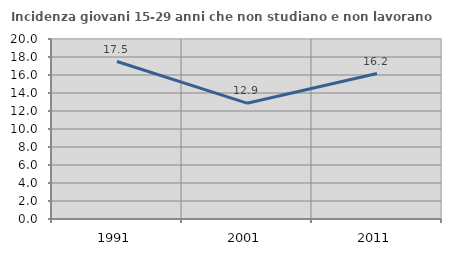
| Category | Incidenza giovani 15-29 anni che non studiano e non lavorano  |
|---|---|
| 1991.0 | 17.498 |
| 2001.0 | 12.868 |
| 2011.0 | 16.157 |